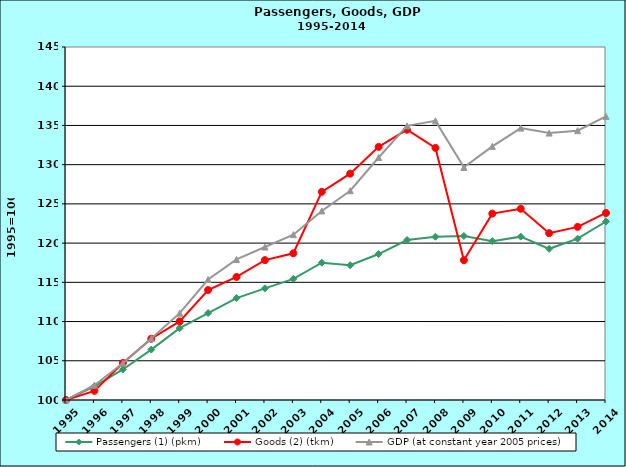
| Category | Passengers (1) (pkm) | Goods (2) (tkm) | GDP (at constant year 2005 prices) |
|---|---|---|---|
| 1995.0 | 100 | 100 | 100 |
| 1996.0 | 101.741 | 101.165 | 101.885 |
| 1997.0 | 103.892 | 104.716 | 104.685 |
| 1998.0 | 106.419 | 107.807 | 107.831 |
| 1999.0 | 109.154 | 110.017 | 111.071 |
| 2000.0 | 111.078 | 114.019 | 115.36 |
| 2001.0 | 112.99 | 115.683 | 117.917 |
| 2002.0 | 114.236 | 117.828 | 119.5 |
| 2003.0 | 115.444 | 118.703 | 121.077 |
| 2004.0 | 117.502 | 126.536 | 124.104 |
| 2005.0 | 117.182 | 128.853 | 126.68 |
| 2006.0 | 118.609 | 132.266 | 130.911 |
| 2007.0 | 120.393 | 134.454 | 134.952 |
| 2008.0 | 120.811 | 132.134 | 135.585 |
| 2009.0 | 120.908 | 117.819 | 129.654 |
| 2010.0 | 120.255 | 123.759 | 132.335 |
| 2011.0 | 120.824 | 124.382 | 134.666 |
| 2012.0 | 119.273 | 121.266 | 134.029 |
| 2013.0 | 120.56 | 122.07 | 134.334 |
| 2014.0 | 122.745 | 123.84 | 136.155 |